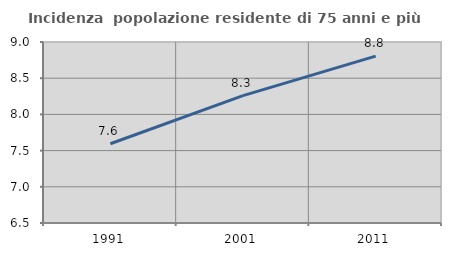
| Category | Incidenza  popolazione residente di 75 anni e più |
|---|---|
| 1991.0 | 7.594 |
| 2001.0 | 8.26 |
| 2011.0 | 8.805 |